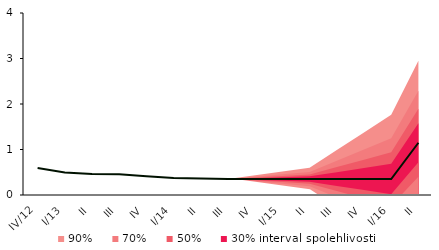
| Category | Centerline |
|---|---|
| IV/12 | 0.591 |
| I/13 | 0.496 |
| II | 0.463 |
| III | 0.458 |
| IV | 0.412 |
| I/14 | 0.372 |
| II | 0.363 |
| III | 0.35 |
| IV | 0.351 |
| I/15 | 0.351 |
| II | 0.351 |
| III | 0.351 |
| IV | 0.351 |
| I/16 | 0.351 |
| II | 1.148 |